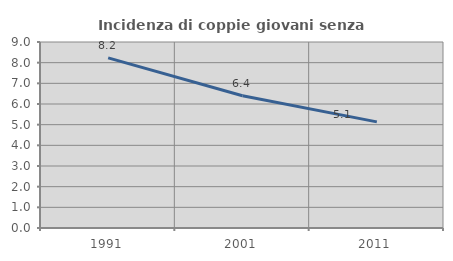
| Category | Incidenza di coppie giovani senza figli |
|---|---|
| 1991.0 | 8.231 |
| 2001.0 | 6.401 |
| 2011.0 | 5.135 |